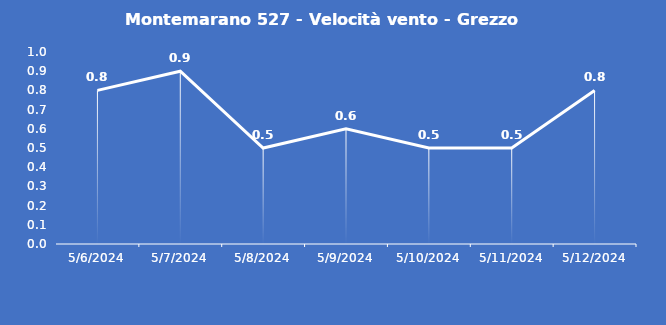
| Category | Montemarano 527 - Velocità vento - Grezzo (m/s) |
|---|---|
| 5/6/24 | 0.8 |
| 5/7/24 | 0.9 |
| 5/8/24 | 0.5 |
| 5/9/24 | 0.6 |
| 5/10/24 | 0.5 |
| 5/11/24 | 0.5 |
| 5/12/24 | 0.8 |